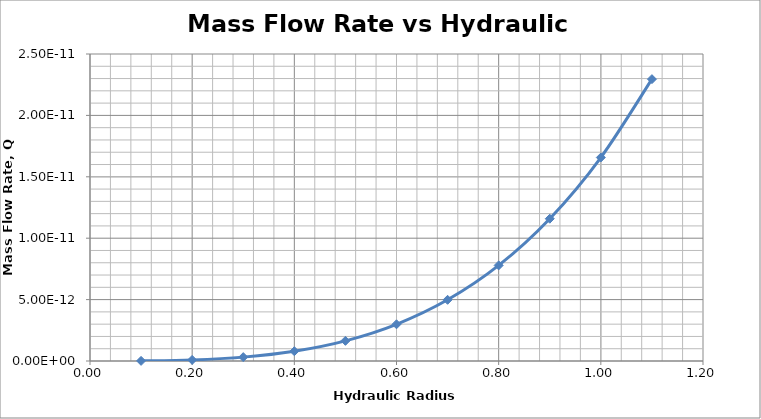
| Category | Series 0 |
|---|---|
| 0.1 | 0 |
| 0.2 | 0 |
| 0.3 | 0 |
| 0.4 | 0 |
| 0.5 | 0 |
| 0.6 | 0 |
| 0.7 | 0 |
| 0.8 | 0 |
| 0.9 | 0 |
| 1.0 | 0 |
| 1.1 | 0 |